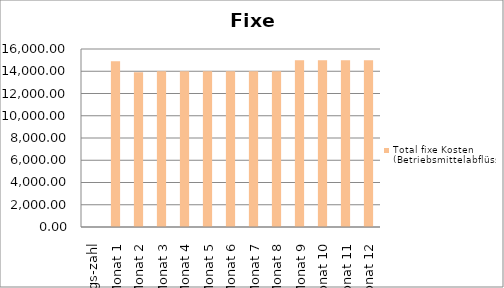
| Category | Total fixe Kosten (Betriebsmittelabflüsse) |
|---|---|
| Anfangs-zahl | 0 |
| Monat 1 | 14900 |
| Monat 2 | 13900 |
| Monat 3 | 14000 |
| Monat 4 | 14000 |
| Monat 5 | 14000 |
| Monat 6 | 14000 |
| Monat 7 | 14000 |
| Monat 8 | 14000 |
| Monat 9 | 15000 |
| Monat 10 | 15000 |
| Monat 11 | 15000 |
| Monat 12 | 15000 |